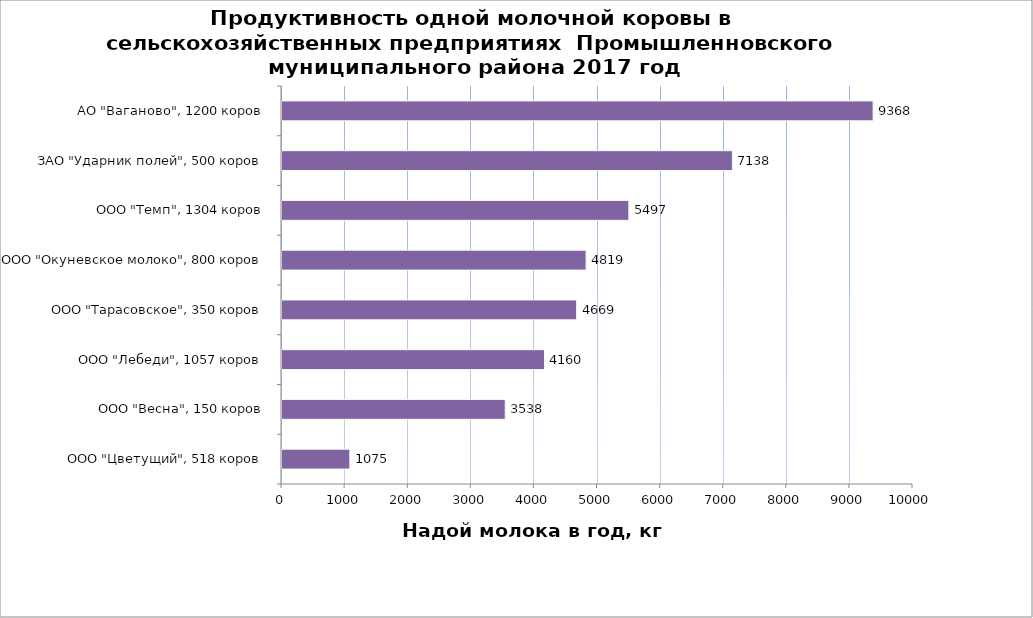
| Category | Series 0 |
|---|---|
| ООО "Цветущий", 518 коров | 1075 |
| ООО "Весна", 150 коров | 3538 |
| ООО "Лебеди", 1057 коров | 4160 |
| ООО "Тарасовское", 350 коров | 4669 |
| ООО "Окуневское молоко", 800 коров | 4819 |
| ООО "Темп", 1304 коров | 5497 |
| ЗАО "Ударник полей", 500 коров | 7138 |
| АО "Ваганово", 1200 коров | 9368 |